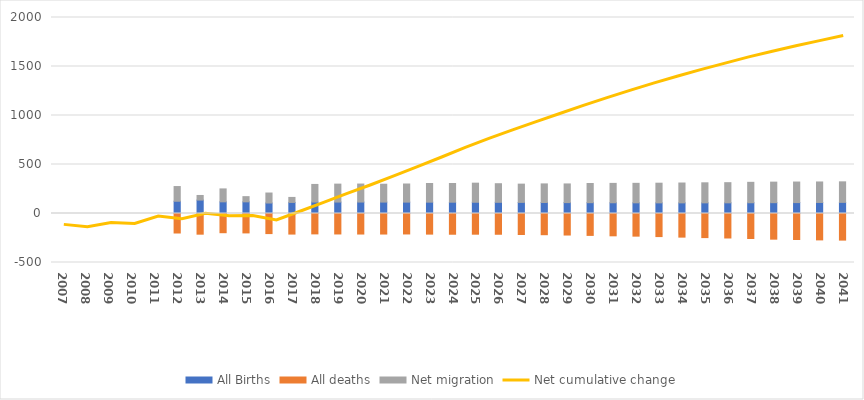
| Category | All Births | All deaths | Net migration |
|---|---|---|---|
| 2007.0 | 0 | 0 | 0 |
| 2008.0 | 0 | 0 | 0 |
| 2009.0 | 0 | 0 | 0 |
| 2010.0 | 0 | 0 | 0 |
| 2011.0 | 0 | 0 | 0 |
| 2012.0 | 125 | -199 | 150 |
| 2013.0 | 137 | -211 | 47 |
| 2014.0 | 119 | -196 | 132 |
| 2015.0 | 119 | -198 | 53 |
| 2016.0 | 107 | -205 | 102 |
| 2017.0 | 113 | -210 | 51 |
| 2018.0 | 116.862 | -208.015 | 179.725 |
| 2019.0 | 116.912 | -208.858 | 182.87 |
| 2020.0 | 116.747 | -209.596 | 183.738 |
| 2021.0 | 116.468 | -209.582 | 182.238 |
| 2022.0 | 116.132 | -208.821 | 184.852 |
| 2023.0 | 115.76 | -210.394 | 190.67 |
| 2024.0 | 115.321 | -211.599 | 191.1 |
| 2025.0 | 114.781 | -211.166 | 194.748 |
| 2026.0 | 114.163 | -211.83 | 189.777 |
| 2027.0 | 113.378 | -214.202 | 186.225 |
| 2028.0 | 112.335 | -216.308 | 189.641 |
| 2029.0 | 111.289 | -219.725 | 190.361 |
| 2030.0 | 110.354 | -223.465 | 195.908 |
| 2031.0 | 109.566 | -227.698 | 197.708 |
| 2032.0 | 108.957 | -231.028 | 198.839 |
| 2033.0 | 108.596 | -235.473 | 200.582 |
| 2034.0 | 108.489 | -241.094 | 202.583 |
| 2035.0 | 108.649 | -245.883 | 204.508 |
| 2036.0 | 109.043 | -249.929 | 205.479 |
| 2037.0 | 109.644 | -255.115 | 208.523 |
| 2038.0 | 110.472 | -261.928 | 209.577 |
| 2039.0 | 111.443 | -265.475 | 209.682 |
| 2040.0 | 112.58 | -269.282 | 209.11 |
| 2041.0 | 113.64 | -271.506 | 209.342 |